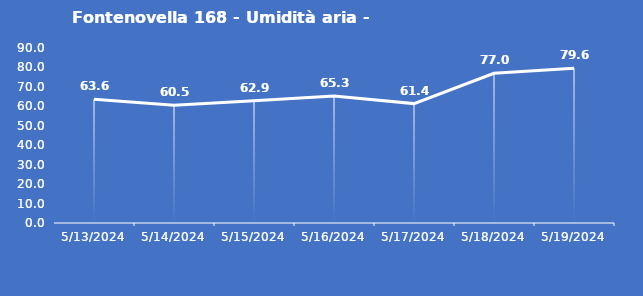
| Category | Fontenovella 168 - Umidità aria - Grezzo (%) |
|---|---|
| 5/13/24 | 63.6 |
| 5/14/24 | 60.5 |
| 5/15/24 | 62.9 |
| 5/16/24 | 65.3 |
| 5/17/24 | 61.4 |
| 5/18/24 | 77 |
| 5/19/24 | 79.6 |